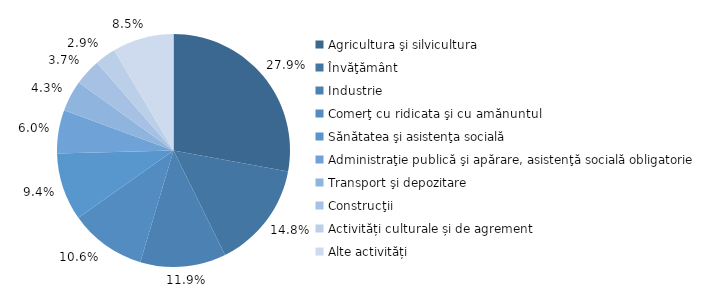
| Category | Series 0 |
|---|---|
| Agricultura şi silvicultura | 0.279 |
| Învăţământ | 0.148 |
| Industrie | 0.119 |
| Comerţ cu ridicata şi cu amănuntul | 0.106 |
| Sănătatea şi asistenţa socială | 0.094 |
| Administraţie publică şi apărare, asistenţă socială obligatorie | 0.06 |
| Transport şi depozitare | 0.043 |
| Construcţii | 0.037 |
| Activități culturale și de agrement | 0.029 |
| Alte activități | 0.085 |